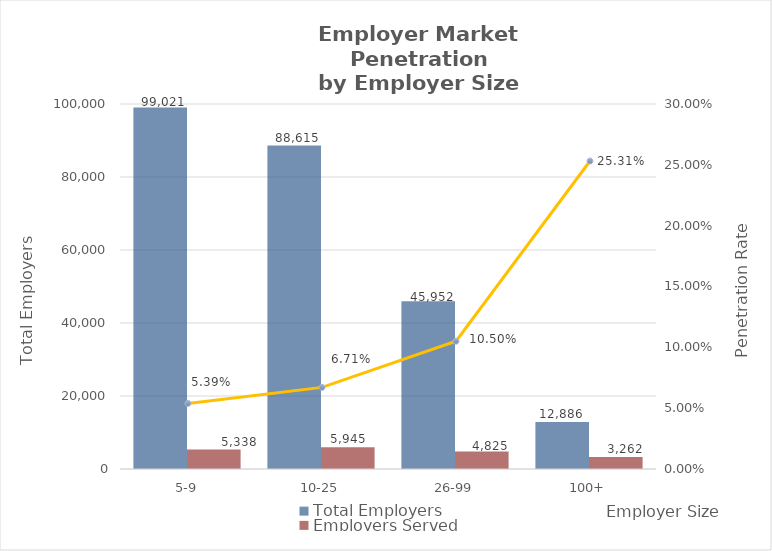
| Category | Total Employers | Employers Served |
|---|---|---|
| 5-9 | 99021 | 5338 |
| 10-25 | 88615 | 5945 |
| 26-99 | 45952 | 4825 |
| 100+ | 12886 | 3262 |